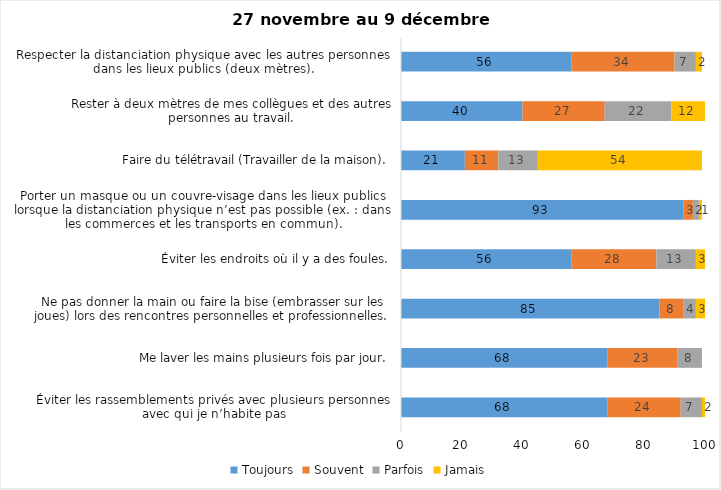
| Category | Toujours | Souvent | Parfois | Jamais |
|---|---|---|---|---|
| Éviter les rassemblements privés avec plusieurs personnes avec qui je n’habite pas | 68 | 24 | 7 | 2 |
| Me laver les mains plusieurs fois par jour. | 68 | 23 | 8 | 0 |
| Ne pas donner la main ou faire la bise (embrasser sur les joues) lors des rencontres personnelles et professionnelles. | 85 | 8 | 4 | 3 |
| Éviter les endroits où il y a des foules. | 56 | 28 | 13 | 3 |
| Porter un masque ou un couvre-visage dans les lieux publics lorsque la distanciation physique n’est pas possible (ex. : dans les commerces et les transports en commun). | 93 | 3 | 2 | 1 |
| Faire du télétravail (Travailler de la maison). | 21 | 11 | 13 | 54 |
| Rester à deux mètres de mes collègues et des autres personnes au travail. | 40 | 27 | 22 | 12 |
| Respecter la distanciation physique avec les autres personnes dans les lieux publics (deux mètres). | 56 | 34 | 7 | 2 |